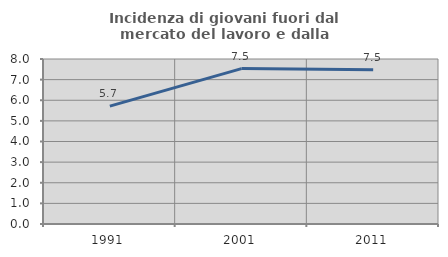
| Category | Incidenza di giovani fuori dal mercato del lavoro e dalla formazione  |
|---|---|
| 1991.0 | 5.714 |
| 2001.0 | 7.536 |
| 2011.0 | 7.483 |